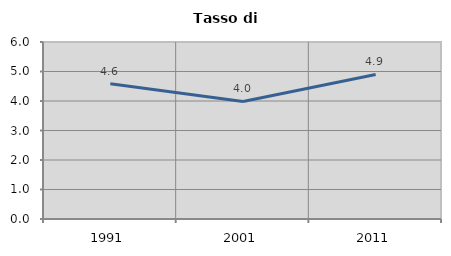
| Category | Tasso di disoccupazione   |
|---|---|
| 1991.0 | 4.584 |
| 2001.0 | 3.986 |
| 2011.0 | 4.899 |